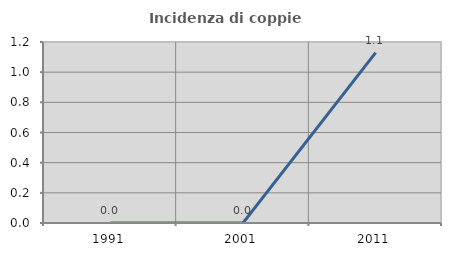
| Category | Incidenza di coppie miste |
|---|---|
| 1991.0 | 0 |
| 2001.0 | 0 |
| 2011.0 | 1.13 |